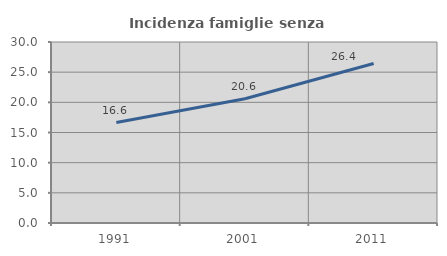
| Category | Incidenza famiglie senza nuclei |
|---|---|
| 1991.0 | 16.648 |
| 2001.0 | 20.603 |
| 2011.0 | 26.442 |